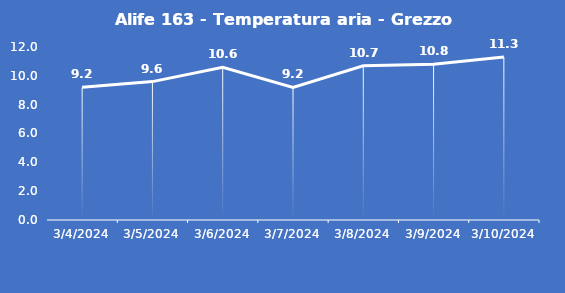
| Category | Alife 163 - Temperatura aria - Grezzo (°C) |
|---|---|
| 3/4/24 | 9.2 |
| 3/5/24 | 9.6 |
| 3/6/24 | 10.6 |
| 3/7/24 | 9.2 |
| 3/8/24 | 10.7 |
| 3/9/24 | 10.8 |
| 3/10/24 | 11.3 |